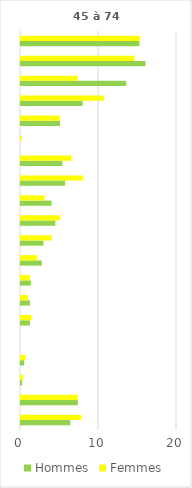
| Category | Hommes | Femmes |
|---|---|---|
| 0 | 6.32 | 7.67 |
| 1 | 7.29 | 7.25 |
| 2 | 0.14 | 0.21 |
| 3 | 0.41 | 0.53 |
| 4 | 0 | 0 |
| 5 | 1.15 | 1.31 |
| 6 | 1.15 | 0.9 |
| 7 | 1.26 | 1.16 |
| 8 | 2.67 | 2.02 |
| 9 | 2.88 | 3.96 |
| 10 | 4.4 | 5.01 |
| 11 | 3.91 | 3 |
| 12 | 5.64 | 7.92 |
| 13 | 5.29 | 6.41 |
| 14 | 0 | 0.13 |
| 15 | 5 | 4.92 |
| 16 | 7.89 | 10.65 |
| 17 | 13.49 | 7.22 |
| 18 | 15.95 | 14.52 |
| 19 | 15.17 | 15.21 |